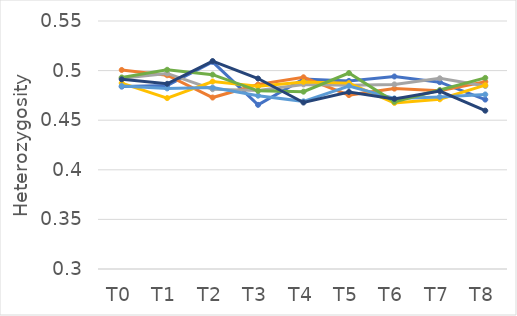
| Category | H1 | H2 | H3 | H4 | H5 | H6 | H7 |
|---|---|---|---|---|---|---|---|
| T0 | 0.484 | 0.501 | 0.492 | 0.487 | 0.485 | 0.493 | 0.491 |
| T1 | 0.485 | 0.495 | 0.497 | 0.472 | 0.482 | 0.501 | 0.487 |
| T2 | 0.509 | 0.473 | 0.481 | 0.489 | 0.483 | 0.496 | 0.51 |
| T3 | 0.465 | 0.486 | 0.48 | 0.484 | 0.475 | 0.48 | 0.492 |
| T4 | 0.492 | 0.493 | 0.486 | 0.489 | 0.469 | 0.479 | 0.468 |
| T5 | 0.49 | 0.475 | 0.485 | 0.487 | 0.485 | 0.498 | 0.478 |
| T6 | 0.494 | 0.482 | 0.486 | 0.467 | 0.472 | 0.469 | 0.472 |
| T7 | 0.488 | 0.48 | 0.492 | 0.471 | 0.473 | 0.48 | 0.479 |
| T8 | 0.471 | 0.489 | 0.484 | 0.485 | 0.476 | 0.493 | 0.46 |